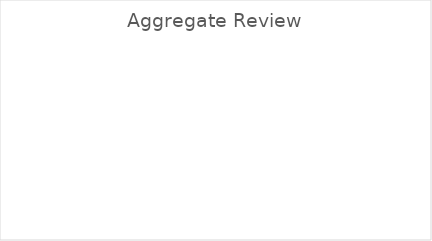
| Category | Series 0 |
|---|---|
| Date Review Decision Made not recorded | 0 |
| Date Review Decision Made is before DNAdj | 0 |
| Date Review Decision Made is no more than 7 days from DNAdj | 0 |
| Date Review Decision Made is more than 7 days from DNAdj | 0 |